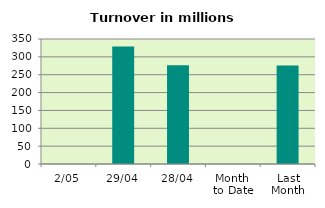
| Category | Series 0 |
|---|---|
| 2/05 | 0 |
| 29/04 | 328.798 |
| 28/04 | 276.617 |
| Month 
to Date | 0 |
| Last
Month | 275.481 |